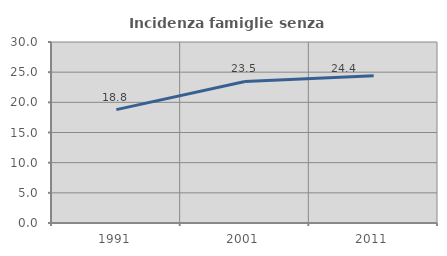
| Category | Incidenza famiglie senza nuclei |
|---|---|
| 1991.0 | 18.787 |
| 2001.0 | 23.464 |
| 2011.0 | 24.394 |